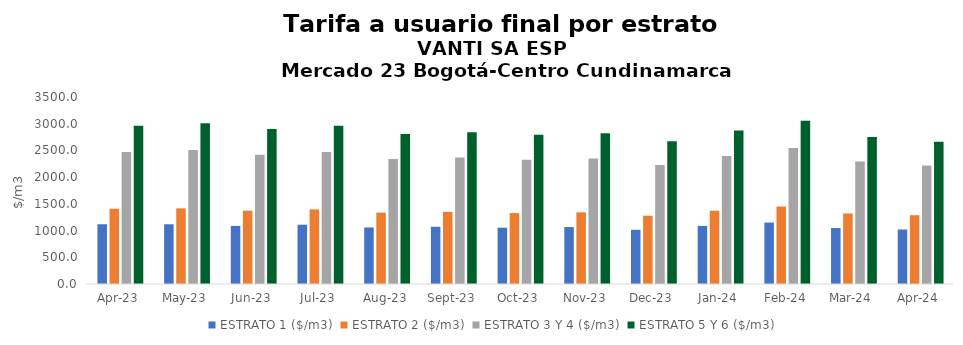
| Category | ESTRATO 1 ($/m3) | ESTRATO 2 ($/m3) | ESTRATO 3 Y 4 ($/m3) | ESTRATO 5 Y 6 ($/m3) |
|---|---|---|---|---|
| 2023-04-01 | 1118.47 | 1407.56 | 2468.54 | 2962.248 |
| 2023-05-01 | 1117.85 | 1415.65 | 2506.69 | 3008.028 |
| 2023-06-01 | 1087.36 | 1371.98 | 2417.38 | 2900.856 |
| 2023-07-01 | 1109.69 | 1396.46 | 2468.54 | 2962.248 |
| 2023-08-01 | 1058.46 | 1336.01 | 2339.09 | 2806.908 |
| 2023-09-01 | 1071.3 | 1349.34 | 2366.44 | 2839.728 |
| 2023-10-01 | 1054.11 | 1327.47 | 2326.42 | 2791.704 |
| 2023-11-01 | 1065.47 | 1341.49 | 2350.92 | 2821.104 |
| 2023-12-01 | 1014.3 | 1278 | 2225.9 | 2671.08 |
| 2024-01-01 | 1087.08 | 1372.02 | 2394.5 | 2873.4 |
| 2024-02-01 | 1150.06 | 1449.99 | 2544.46 | 3053.352 |
| 2024-03-01 | 1047.13 | 1320.38 | 2293.74 | 2752.488 |
| 2024-04-01 | 1020.54 | 1287.2 | 2219.14 | 2662.968 |